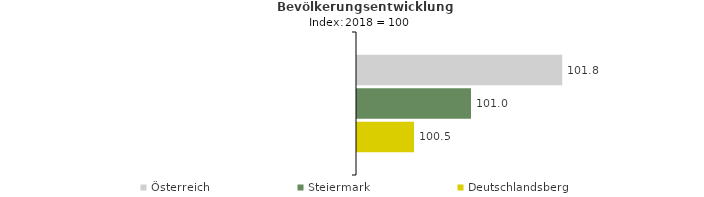
| Category | Österreich | Steiermark | Deutschlandsberg |
|---|---|---|---|
| 2022.0 | 101.8 | 101 | 100.5 |